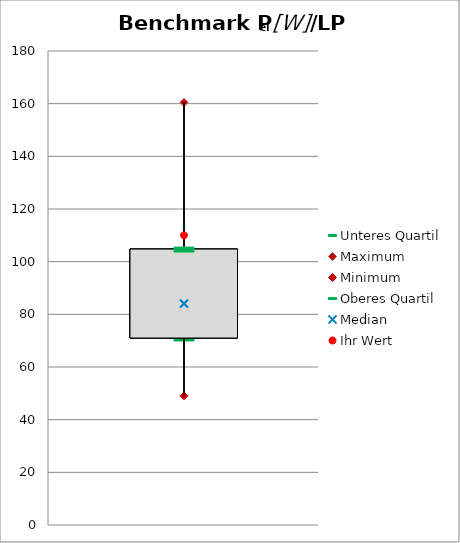
| Category | Unteres Quartil | Maximum | Minimum | Oberes Quartil |
|---|---|---|---|---|
| Pel [W]/LP | 71.005 | 160.465 | 49.048 | 104.786 |